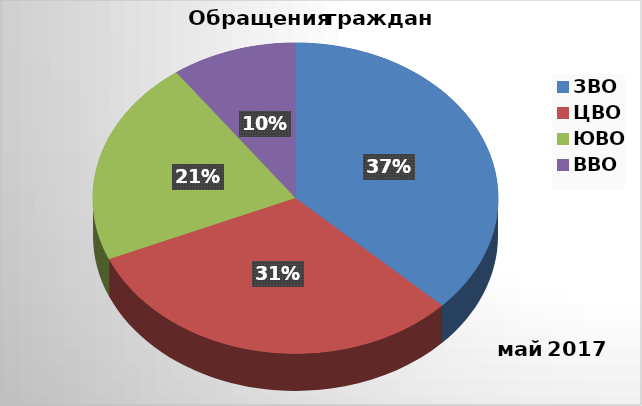
| Category | Series 0 |
|---|---|
| ЗВО | 26 |
| ЦВО | 22 |
| ЮВО | 15 |
| ВВО | 7 |